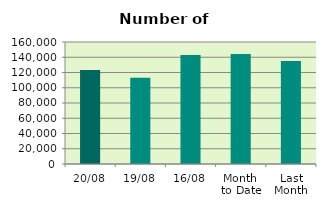
| Category | Series 0 |
|---|---|
| 20/08 | 123362 |
| 19/08 | 113168 |
| 16/08 | 142882 |
| Month 
to Date | 144138 |
| Last
Month | 134976 |